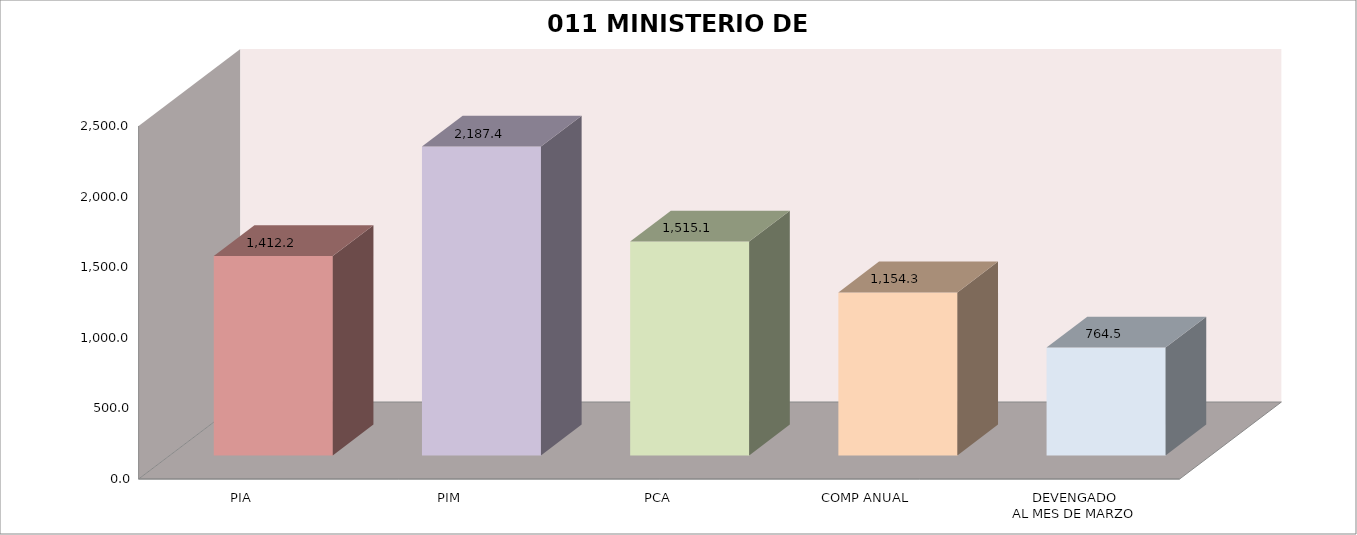
| Category | 011 MINISTERIO DE SALUD |
|---|---|
| PIA | 1412.218 |
| PIM | 2187.43 |
| PCA | 1515.109 |
| COMP ANUAL | 1154.287 |
| DEVENGADO
AL MES DE MARZO | 764.453 |